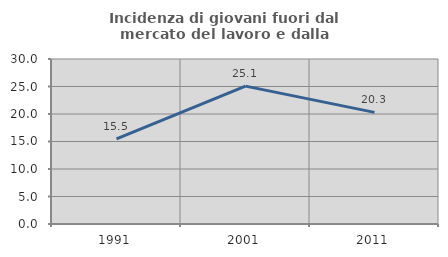
| Category | Incidenza di giovani fuori dal mercato del lavoro e dalla formazione  |
|---|---|
| 1991.0 | 15.465 |
| 2001.0 | 25.063 |
| 2011.0 | 20.294 |